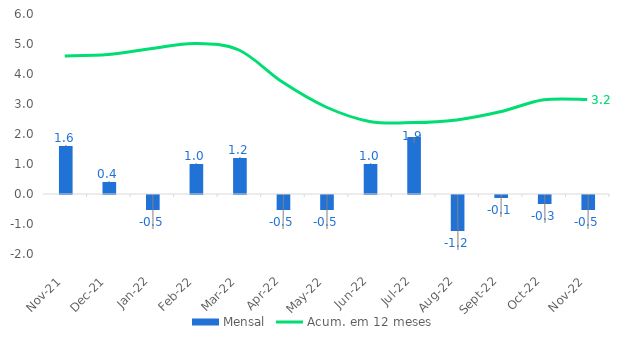
| Category | Mensal |
|---|---|
| 2021-11-01 | 1.6 |
| 2021-12-01 | 0.4 |
| 2022-01-01 | -0.5 |
| 2022-02-01 | 1 |
| 2022-03-01 | 1.2 |
| 2022-04-01 | -0.5 |
| 2022-05-01 | -0.5 |
| 2022-06-01 | 1 |
| 2022-07-01 | 1.9 |
| 2022-08-01 | -1.2 |
| 2022-09-01 | -0.1 |
| 2022-10-01 | -0.3 |
| 2022-11-01 | -0.5 |